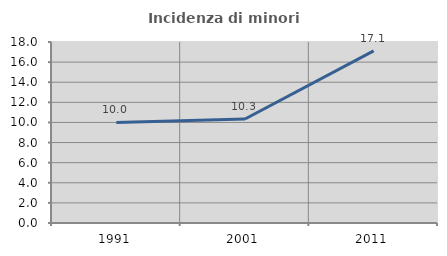
| Category | Incidenza di minori stranieri |
|---|---|
| 1991.0 | 10 |
| 2001.0 | 10.345 |
| 2011.0 | 17.117 |